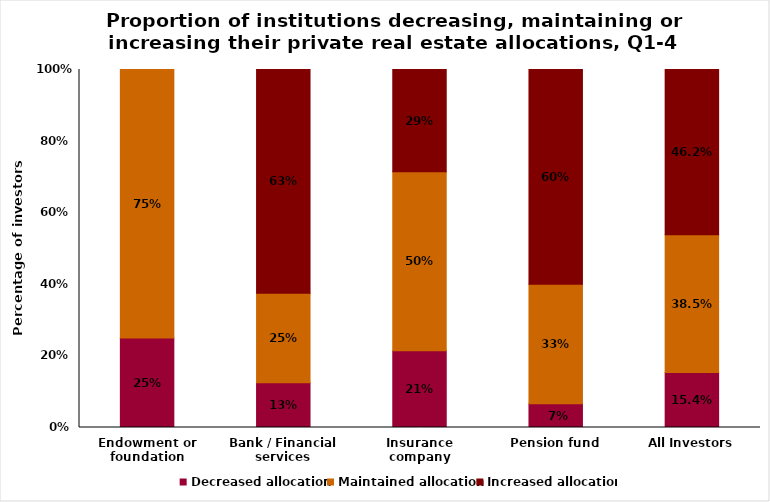
| Category | Decreased allocation | Maintained allocation | Increased allocation |
|---|---|---|---|
| Endowment or foundation | 0.25 | 0.75 | 0 |
| Bank / Financial services | 0.125 | 0.25 | 0.625 |
| Insurance company | 0.214 | 0.5 | 0.286 |
| Pension fund | 0.067 | 0.333 | 0.6 |
| All Investors | 0.154 | 0.385 | 0.462 |